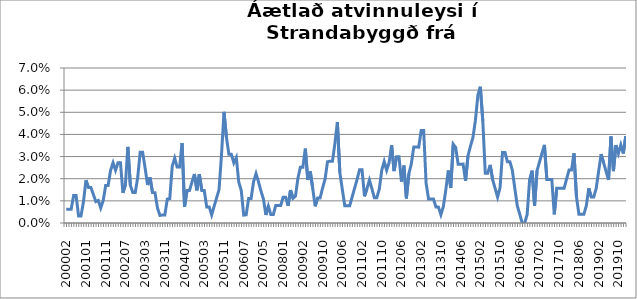
| Category | Series 0 |
|---|---|
| 200002 | 0.006 |
| 200003 | 0.006 |
| 200004 | 0.006 |
| 200005 | 0.012 |
| 200006 | 0.012 |
| 200007 | 0.003 |
| 200011 | 0.003 |
| 200012 | 0.01 |
| 200101 | 0.019 |
| 200103 | 0.016 |
| 200104 | 0.016 |
| 200105 | 0.013 |
| 200106 | 0.01 |
| 200107 | 0.01 |
| 200108 | 0.007 |
| 200110 | 0.01 |
| 200111 | 0.017 |
| 200112 | 0.017 |
| 200201 | 0.024 |
| 200202 | 0.027 |
| 200203 | 0.024 |
| 200204 | 0.027 |
| 200205 | 0.027 |
| 200206 | 0.014 |
| 200207 | 0.017 |
| 200208 | 0.034 |
| 200209 | 0.017 |
| 200210 | 0.014 |
| 200211 | 0.014 |
| 200212 | 0.021 |
| 200301 | 0.032 |
| 200302 | 0.032 |
| 200303 | 0.025 |
| 200304 | 0.017 |
| 200305 | 0.021 |
| 200306 | 0.014 |
| 200307 | 0.014 |
| 200308 | 0.007 |
| 200309 | 0.003 |
| 200310 | 0.004 |
| 200311 | 0.004 |
| 200312 | 0.011 |
| 200401 | 0.011 |
| 200402 | 0.026 |
| 200403 | 0.029 |
| 200404 | 0.025 |
| 200405 | 0.025 |
| 200406 | 0.036 |
| 200407 | 0.007 |
| 200408 | 0.015 |
| 200409 | 0.015 |
| 200410 | 0.018 |
| 200411 | 0.022 |
| 200412 | 0.015 |
| 200501 | 0.022 |
| 200502 | 0.015 |
| 200503 | 0.015 |
| 200504 | 0.007 |
| 200505 | 0.007 |
| 200506 | 0.004 |
| 200507 | 0.008 |
| 200508 | 0.011 |
| 200509 | 0.015 |
| 200510 | 0.031 |
| 200511 | 0.05 |
| 200512 | 0.039 |
| 200601 | 0.031 |
| 200602 | 0.031 |
| 200603 | 0.027 |
| 200604 | 0.03 |
| 200605 | 0.018 |
| 200606 | 0.015 |
| 200607 | 0.004 |
| 200610 | 0.004 |
| 200611 | 0.011 |
| 200612 | 0.011 |
| 200701 | 0.019 |
| 200702 | 0.022 |
| 200703 | 0.019 |
| 200704 | 0.014 |
| 200705 | 0.011 |
| 200706 | 0.004 |
| 200707 | 0.008 |
| 200708 | 0.004 |
| 200709 | 0.004 |
| 200710 | 0.008 |
| 200711 | 0.008 |
| 200712 | 0.008 |
| 200801 | 0.012 |
| 200802 | 0.012 |
| 200803 | 0.008 |
| 200804 | 0.015 |
| 200805 | 0.011 |
| 200811 | 0.012 |
| 200812 | 0.02 |
| 200901 | 0.025 |
| 200902 | 0.025 |
| 200903 | 0.034 |
| 200904 | 0.019 |
| 200905 | 0.023 |
| 200906 | 0.016 |
| 200907 | 0.008 |
| 200908 | 0.011 |
| 200909 | 0.011 |
| 200910 | 0.016 |
| 200911 | 0.02 |
| 200912 | 0.028 |
| 201001 | 0.028 |
| 201002 | 0.028 |
| 201003 | 0.036 |
| 201004 | 0.046 |
| 201005 | 0.023 |
| 201006 | 0.015 |
| 201007 | 0.008 |
| 201008 | 0.008 |
| 201009 | 0.008 |
| 201010 | 0.012 |
| 201011 | 0.016 |
| 201012 | 0.02 |
| 201101 | 0.024 |
| 201102 | 0.024 |
| 201103 | 0.012 |
| 201104 | 0.016 |
| 201105 | 0.019 |
| 201106 | 0.016 |
| 201107 | 0.011 |
| 201108 | 0.011 |
| 201109 | 0.015 |
| 201110 | 0.024 |
| 201111 | 0.028 |
| 201112 | 0.024 |
| 201201 | 0.027 |
| 201202 | 0.035 |
| 201203 | 0.023 |
| 201204 | 0.03 |
| 201205 | 0.03 |
| 201206 | 0.019 |
| 201207 | 0.026 |
| 201208 | 0.011 |
| 201209 | 0.022 |
| 201210 | 0.027 |
| 201211 | 0.034 |
| 201212 | 0.034 |
| 201301 | 0.034 |
| 201302 | 0.042 |
| 201303 | 0.042 |
| 201304 | 0.018 |
| 201305 | 0.011 |
| 201306 | 0.011 |
| 201307 | 0.011 |
| 201308 | 0.007 |
| 201309 | 0.007 |
| 201310 | 0.004 |
| 201311 | 0.007 |
| 201312 | 0.015 |
| 201401 | 0.024 |
| 201402 | 0.016 |
| 201403 | 0.036 |
| 201404 | 0.034 |
| 201405 | 0.027 |
| 201406 | 0.027 |
| 201407 | 0.027 |
| 201408 | 0.019 |
| 201409 | 0.03 |
| 201410 | 0.035 |
| 201411 | 0.039 |
| 201412 | 0.046 |
| 201501 | 0.058 |
| 201502 | 0.062 |
| 201503 | 0.046 |
| 201504 | 0.022 |
| 201505 | 0.022 |
| 201506 | 0.026 |
| 201507 | 0.02 |
| 201508 | 0.016 |
| 201509 | 0.012 |
| 201510 | 0.016 |
| 201511 | 0.032 |
| 201512 | 0.032 |
| 201601 | 0.028 |
| 201602 | 0.028 |
| 201603 | 0.024 |
| 201604 | 0.016 |
| 201605 | 0.008 |
| 201606 | 0.004 |
| 201607 | 0 |
| 201608 | 0 |
| 201609 | 0.004 |
| 201610 | 0.02 |
| 201611 | 0.024 |
| 201612 | 0.008 |
| 201701 | 0.024 |
| 201702 | 0.028 |
| 201703 | 0.031 |
| 201704 | 0.035 |
| 201705 | 0.02 |
| 201706 | 0.02 |
| 201707 | 0.02 |
| 201708 | 0.004 |
| 201709 | 0.016 |
| 201710 | 0.016 |
| 201711 | 0.016 |
| 201712 | 0.016 |
| 201801 | 0.02 |
| 201802 | 0.024 |
| 201803 | 0.024 |
| 201804 | 0.031 |
| 201805 | 0.012 |
| 201806 | 0.004 |
| 201807 | 0.004 |
| 201808 | 0.004 |
| 201809 | 0.008 |
| 201810 | 0.016 |
| 201811 | 0.012 |
| 201812 | 0.012 |
| 201901 | 0.016 |
| 201902 | 0.023 |
| 201903 | 0.031 |
| 201904 | 0.027 |
| 201905 | 0.023 |
| 201906 | 0.019 |
| 201907 | 0.039 |
| 201908 | 0.023 |
| 201909 | 0.035 |
| 201910 | 0.031 |
| 201911 | 0.035 |
| 201912 | 0.031 |
| 202001 | 0.039 |